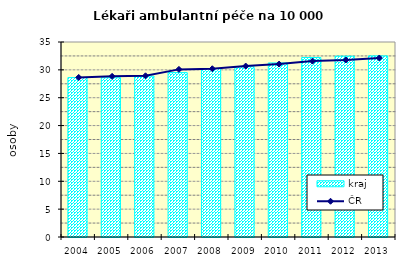
| Category | kraj |
|---|---|
| 2004.0 | 28.609 |
| 2005.0 | 28.578 |
| 2006.0 | 28.88 |
| 2007.0 | 29.508 |
| 2008.0 | 30.247 |
| 2009.0 | 30.56 |
| 2010.0 | 31.243 |
| 2011.0 | 32.218 |
| 2012.0 | 32.461 |
| 2013.0 | 32.508 |